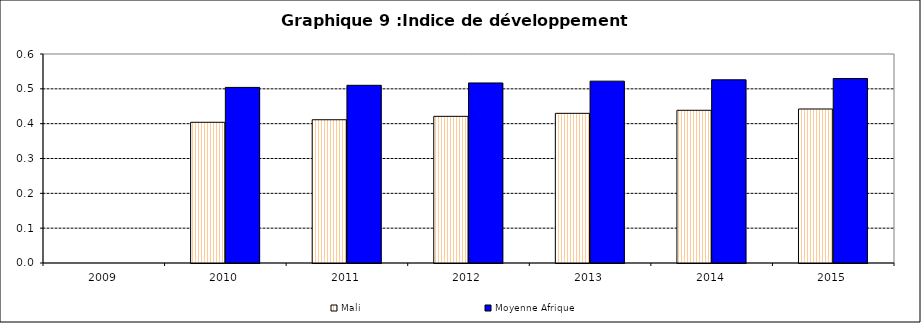
| Category | Mali | Moyenne Afrique |
|---|---|---|
| 2009.0 | 0 | 0 |
| 2010.0 | 0.404 | 0.504 |
| 2011.0 | 0.411 | 0.51 |
| 2012.0 | 0.421 | 0.517 |
| 2013.0 | 0.43 | 0.522 |
| 2014.0 | 0.438 | 0.526 |
| 2015.0 | 0.442 | 0.53 |